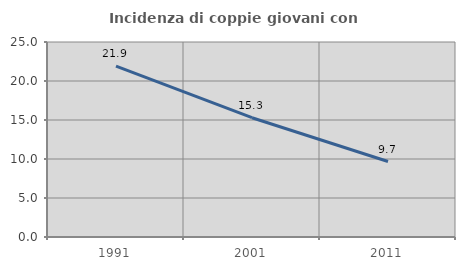
| Category | Incidenza di coppie giovani con figli |
|---|---|
| 1991.0 | 21.918 |
| 2001.0 | 15.294 |
| 2011.0 | 9.677 |